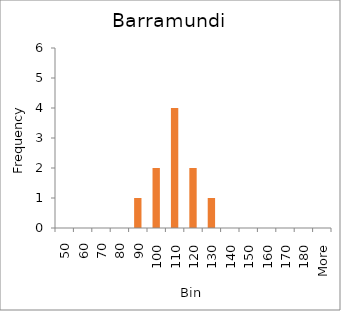
| Category | Frequency |
|---|---|
| 50 | 0 |
| 60 | 0 |
| 70 | 0 |
| 80 | 0 |
| 90 | 1 |
| 100 | 2 |
| 110 | 4 |
| 120 | 2 |
| 130 | 1 |
| 140 | 0 |
| 150 | 0 |
| 160 | 0 |
| 170 | 0 |
| 180 | 0 |
| More | 0 |